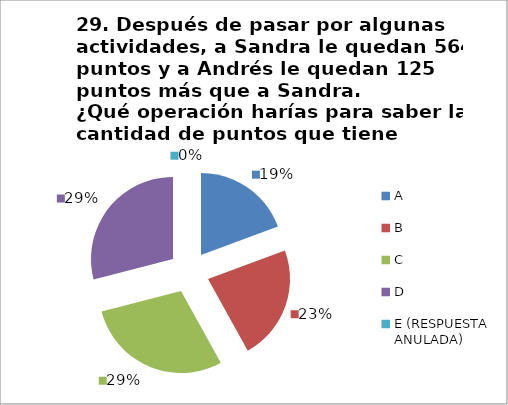
| Category | CANTIDAD DE RESPUESTAS PREGUNTA (29) | PORCENTAJE |
|---|---|---|
| A | 6 | 0.194 |
| B | 7 | 0.226 |
| C | 9 | 0.29 |
| D | 9 | 0.29 |
| E (RESPUESTA ANULADA) | 0 | 0 |